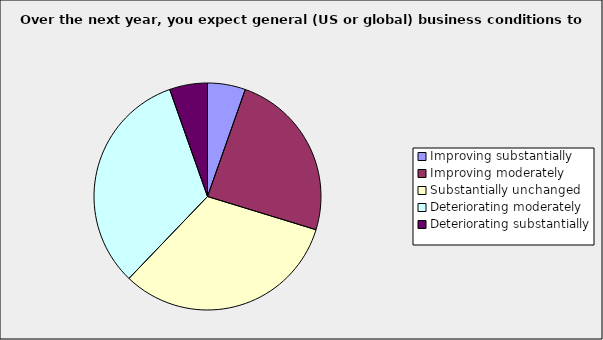
| Category | Series 0 |
|---|---|
| Improving substantially | 0.054 |
| Improving moderately | 0.243 |
| Substantially unchanged | 0.324 |
| Deteriorating moderately | 0.324 |
| Deteriorating substantially | 0.054 |